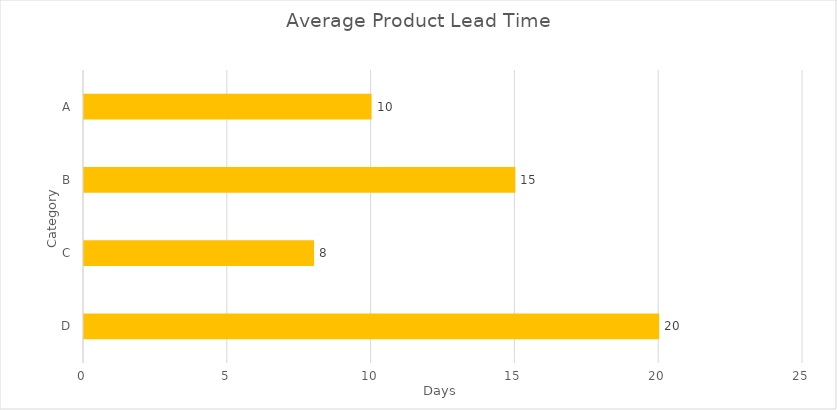
| Category | Lead time |
|---|---|
| A | 10 |
| B | 15 |
| C | 8 |
| D | 20 |